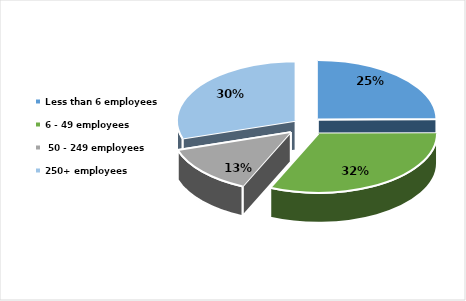
| Category | Series 0 |
|---|---|
| Less than 6 employees | 0.249 |
| 6 - 49 employees | 0.318 |
|  50 - 249 employees | 0.135 |
| 250+ employees | 0.299 |